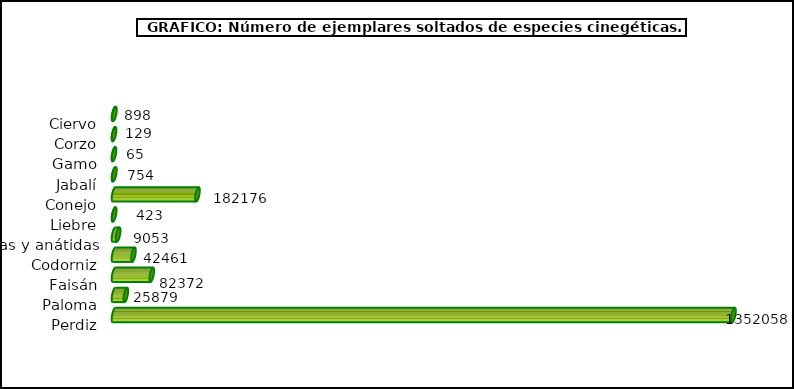
| Category | Series 1 |
|---|---|
| Ciervo | 898 |
| Corzo | 129 |
| Gamo | 65 |
| Jabalí | 754 |
| Conejo | 182176 |
| Liebre | 423 |
| Acuáticas y anátidas | 9053 |
| Codorniz | 42461 |
| Faisán | 82372 |
| Paloma | 25879 |
| Perdiz | 1352058 |